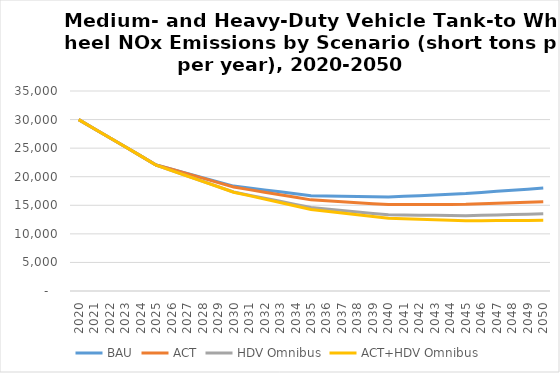
| Category | BAU | ACT | HDV Omnibus | ACT+HDV Omnibus |
|---|---|---|---|---|
| 2020.0 | 29990 | 29990 | 29990 | 29990 |
| 2021.0 | 28400 | 28400 | 28400 | 28400 |
| 2022.0 | 26810 | 26810 | 26810 | 26810 |
| 2023.0 | 25230 | 25230 | 25230 | 25230 |
| 2024.0 | 23640 | 23640 | 23640 | 23640 |
| 2025.0 | 22050 | 22050 | 22020 | 22020 |
| 2026.0 | 21310 | 21310 | 21080 | 21080 |
| 2027.0 | 20570 | 20530 | 20140 | 20130 |
| 2028.0 | 19840 | 19750 | 19210 | 19190 |
| 2029.0 | 19100 | 18970 | 18270 | 18240 |
| 2030.0 | 18360 | 18190 | 17330 | 17290 |
| 2031.0 | 18020 | 17740 | 16780 | 16690 |
| 2032.0 | 17690 | 17290 | 16240 | 16080 |
| 2033.0 | 17350 | 16850 | 15690 | 15480 |
| 2034.0 | 17020 | 16400 | 15150 | 14870 |
| 2035.0 | 16680 | 15950 | 14600 | 14270 |
| 2036.0 | 16630 | 15780 | 14350 | 13960 |
| 2037.0 | 16580 | 15620 | 14090 | 13660 |
| 2038.0 | 16540 | 15450 | 13840 | 13350 |
| 2039.0 | 16490 | 15290 | 13580 | 13050 |
| 2040.0 | 16440 | 15120 | 13330 | 12740 |
| 2041.0 | 16560 | 15130 | 13300 | 12650 |
| 2042.0 | 16690 | 15140 | 13270 | 12560 |
| 2043.0 | 16810 | 15140 | 13250 | 12480 |
| 2044.0 | 16940 | 15150 | 13220 | 12390 |
| 2045.0 | 17060 | 15160 | 13190 | 12300 |
| 2046.0 | 17250 | 15250 | 13250 | 12310 |
| 2047.0 | 17440 | 15340 | 13310 | 12320 |
| 2048.0 | 17630 | 15430 | 13380 | 12340 |
| 2049.0 | 17820 | 15520 | 13440 | 12350 |
| 2050.0 | 18010 | 15610 | 13500 | 12360 |